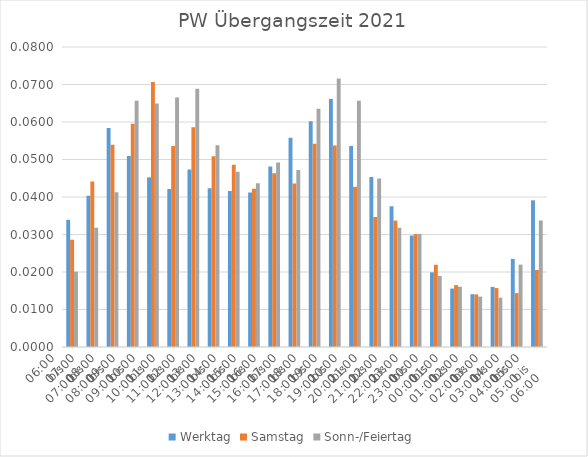
| Category | Werktag | Samstag | Sonn-/Feiertag |
|---|---|---|---|
| 06:00
bis
07:00 | 0.034 | 0.029 | 0.02 |
| 07:00
bis
08:00 | 0.04 | 0.044 | 0.032 |
| 08:00
bis
09:00 | 0.058 | 0.054 | 0.041 |
| 09:00
bis
10:00 | 0.051 | 0.06 | 0.066 |
| 10:00
bis
11:00 | 0.045 | 0.071 | 0.065 |
| 11:00
bis
12:00 | 0.042 | 0.054 | 0.067 |
| 12:00
bis
13:00 | 0.047 | 0.059 | 0.069 |
| 13:00
bis
14:00 | 0.042 | 0.051 | 0.054 |
| 14:00
bis
15:00 | 0.042 | 0.049 | 0.047 |
| 15:00
bis
16:00 | 0.041 | 0.042 | 0.044 |
| 16:00
bis
17:00 | 0.048 | 0.046 | 0.049 |
| 17:00
bis
18:00 | 0.056 | 0.044 | 0.047 |
| 18:00
bis
19:00 | 0.06 | 0.054 | 0.064 |
| 19:00
bis
20:00 | 0.066 | 0.054 | 0.072 |
| 20:00
bis
21:00 | 0.054 | 0.043 | 0.066 |
| 21:00
bis
22:00 | 0.045 | 0.035 | 0.045 |
| 22:00
bis
23:00 | 0.038 | 0.034 | 0.032 |
| 23:00
bis
00:00 | 0.03 | 0.03 | 0.03 |
| 00:00
bis
01:00 | 0.02 | 0.022 | 0.019 |
| 01:00
bis
02:00 | 0.016 | 0.016 | 0.016 |
| 02:00
bis
03:00 | 0.014 | 0.014 | 0.013 |
| 03:00
bis
04:00 | 0.016 | 0.016 | 0.013 |
| 04:00
bis
05:00 | 0.024 | 0.014 | 0.022 |
| 05:00
bis
06:00 | 0.039 | 0.021 | 0.034 |